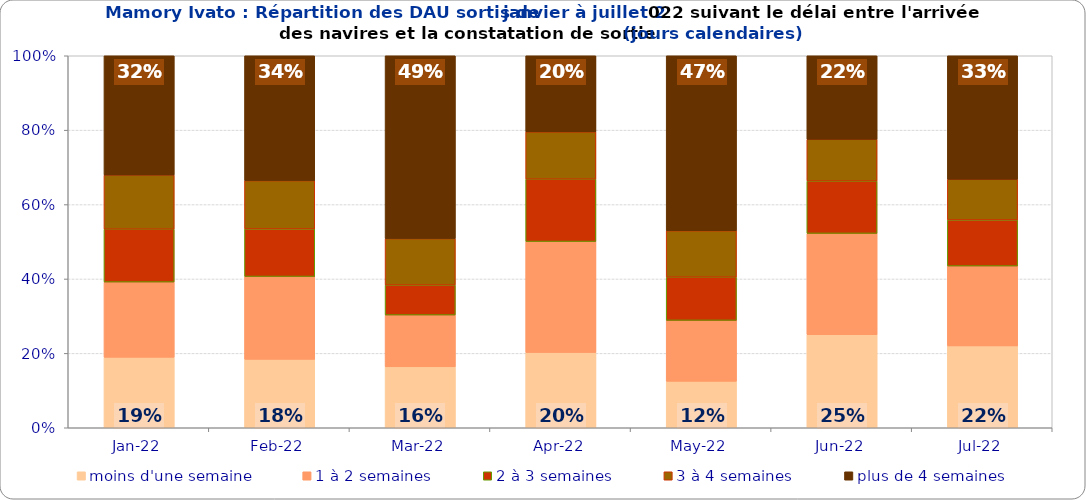
| Category | moins d'une semaine | 1 à 2 semaines | 2 à 3 semaines | 3 à 4 semaines | plus de 4 semaines |
|---|---|---|---|---|---|
| 2022-01-01 | 0.189 | 0.202 | 0.142 | 0.146 | 0.321 |
| 2022-02-01 | 0.184 | 0.223 | 0.128 | 0.13 | 0.336 |
| 2022-03-01 | 0.164 | 0.139 | 0.081 | 0.125 | 0.491 |
| 2022-04-01 | 0.202 | 0.298 | 0.168 | 0.127 | 0.205 |
| 2022-05-01 | 0.125 | 0.164 | 0.116 | 0.125 | 0.47 |
| 2022-06-01 | 0.25 | 0.272 | 0.141 | 0.112 | 0.224 |
| 2022-07-01 | 0.22 | 0.215 | 0.124 | 0.109 | 0.332 |